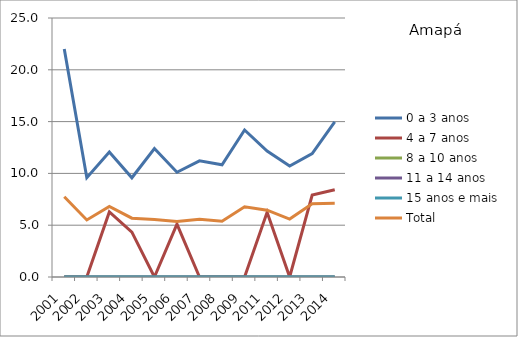
| Category | 0 a 3 anos | 4 a 7 anos | 8 a 10 anos | 11 a 14 anos | 15 anos e mais | Total |
|---|---|---|---|---|---|---|
| 2001.0 | 22.017 | 0 | 0 | 0 | 0 | 7.748 |
| 2002.0 | 9.578 | 0 | 0 | 0 | 0 | 5.509 |
| 2003.0 | 12.067 | 6.276 | 0 | 0 | 0 | 6.809 |
| 2004.0 | 9.579 | 4.325 | 0 | 0 | 0 | 5.676 |
| 2005.0 | 12.4 | 0 | 0 | 0 | 0 | 5.555 |
| 2006.0 | 10.112 | 5.112 | 0 | 0 | 0 | 5.352 |
| 2007.0 | 11.211 | 0 | 0 | 0 | 0 | 5.576 |
| 2008.0 | 10.833 | 0 | 0 | 0 | 0 | 5.374 |
| 2009.0 | 14.187 | 0 | 0 | 0 | 0 | 6.78 |
| 2011.0 | 12.164 | 6.242 | 0 | 0 | 0 | 6.45 |
| 2012.0 | 10.716 | 0 | 0 | 0 | 0 | 5.596 |
| 2013.0 | 11.909 | 7.91 | 0 | 0 | 0 | 7.06 |
| 2014.0 | 14.979 | 8.422 | 0 | 0 | 0 | 7.113 |